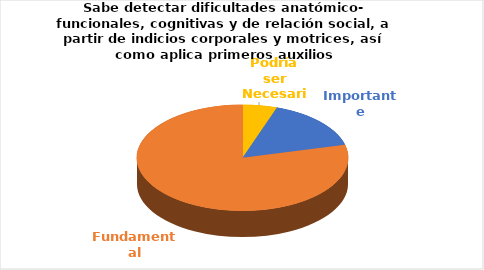
| Category | Series 0 |
|---|---|
| Podría ser Necesaria | 1 |
| Importante | 3 |
| Fundamental | 15 |